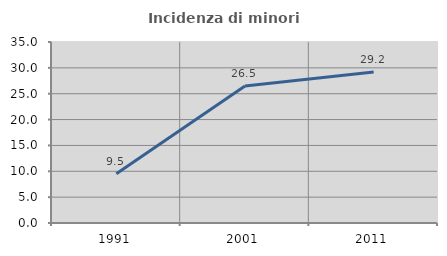
| Category | Incidenza di minori stranieri |
|---|---|
| 1991.0 | 9.524 |
| 2001.0 | 26.506 |
| 2011.0 | 29.177 |